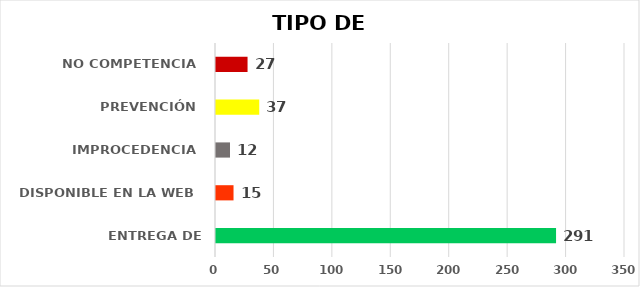
| Category | CANTIDAD DE RESPUESTAS |
|---|---|
| ENTREGA DE INFORMACIÓN | 291 |
| DISPONIBLE EN LA WEB | 15 |
| IMPROCEDENCIA | 12 |
| PREVENCIÓN | 37 |
| NO COMPETENCIA | 27 |